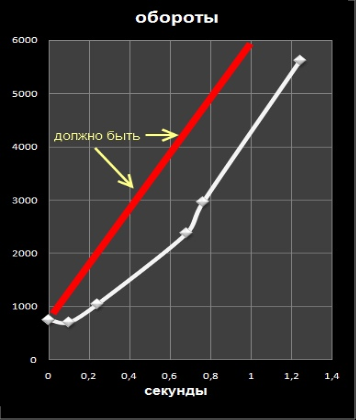
| Category | обороты |
|---|---|
| 0.0 | 750.05 |
| 0.1 | 707.19 |
| 0.24 | 1050.07 |
| 0.68 | 2378.73 |
| 0.76 | 2957.34 |
| 1.24 | 5614.66 |